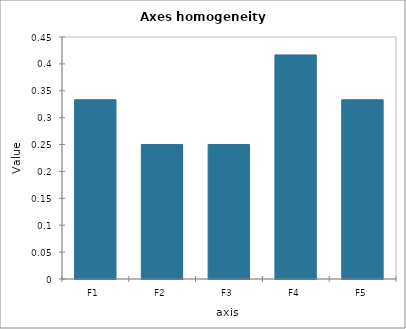
| Category | Value |
|---|---|
| F1 | 0.333 |
| F2 | 0.25 |
| F3 | 0.25 |
| F4 | 0.417 |
| F5 | 0.333 |